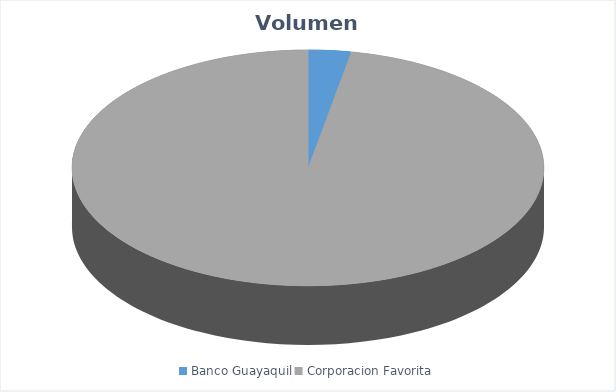
| Category | VOLUMEN ($USD) |
|---|---|
| Banco Guayaquil | 1953.6 |
| Corporacion Favorita | 65001.6 |